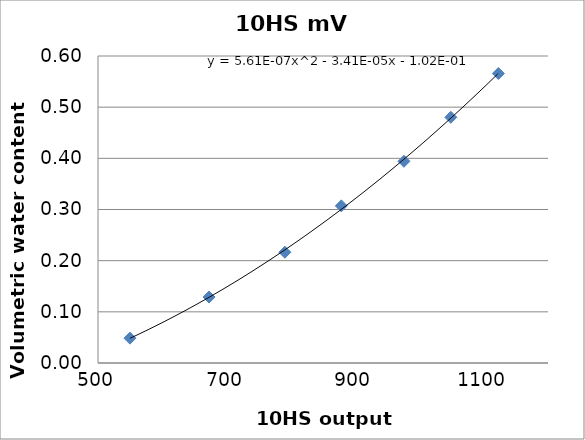
| Category | Series 0 |
|---|---|
| 549.6826171875 | 0.049 |
| 672.7294921875 | 0.129 |
| 790.6494140625 | 0.216 |
| 878.5400390625 | 0.307 |
| 975.9521484375 | 0.394 |
| 1048.828125 | 0.48 |
| 1122.802734375 | 0.566 |